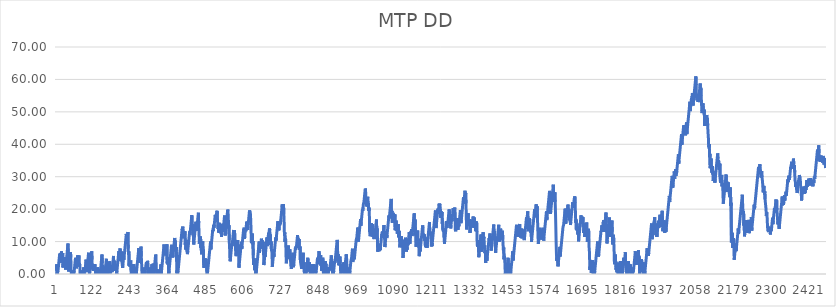
| Category | MTP DD |
|---|---|
| 0 | 1 |
| 1 | 2 |
| 2 | 3 |
| 3 | 0 |
| 4 | 0 |
| 5 | 0 |
| 6 | 1 |
| 7 | 2 |
| 8 | 3 |
| 9 | 4 |
| 10 | 5 |
| 11 | 6 |
| 12 | 5.38 |
| 13 | 6.38 |
| 14 | 3.98 |
| 15 | 4.98 |
| 16 | 5.98 |
| 17 | 6.98 |
| 18 | 3.45 |
| 19 | 4.45 |
| 20 | 5.45 |
| 21 | 6.45 |
| 22 | 2.04 |
| 23 | 3.04 |
| 24 | 2.14 |
| 25 | 3.14 |
| 26 | 4.14 |
| 27 | 5.14 |
| 28 | 2.4 |
| 29 | 3.4 |
| 30 | 1.39 |
| 31 | 2.39 |
| 32 | 3.39 |
| 33 | 4.39 |
| 34 | 5.39 |
| 35 | 6.39 |
| 36 | 7.39 |
| 37 | 8.39 |
| 38 | 9.39 |
| 39 | 5.57 |
| 40 | 0.77 |
| 41 | 1.77 |
| 42 | 2.77 |
| 43 | 3.77 |
| 44 | 4.77 |
| 45 | 5.77 |
| 46 | 6.77 |
| 47 | 5.054 |
| 48 | 0.644 |
| 49 | 0 |
| 50 | 0 |
| 51 | 0 |
| 52 | 1 |
| 53 | 0 |
| 54 | 0 |
| 55 | 1 |
| 56 | 0.07 |
| 57 | 0 |
| 58 | 1 |
| 59 | 2 |
| 60 | 3 |
| 61 | 4 |
| 62 | 5 |
| 63 | 3.9 |
| 64 | 4.9 |
| 65 | 1.76 |
| 66 | 2.76 |
| 67 | 3.76 |
| 68 | 4.76 |
| 69 | 5.76 |
| 70 | 2.72 |
| 71 | 3.72 |
| 72 | 4.72 |
| 73 | 5.72 |
| 74 | 2.29 |
| 75 | 3.29 |
| 76 | 2.47 |
| 77 | 0 |
| 78 | 0 |
| 79 | 0 |
| 80 | 1 |
| 81 | 0 |
| 82 | 1 |
| 83 | 0 |
| 84 | 1 |
| 85 | 0.09 |
| 86 | 0 |
| 87 | 1 |
| 88 | 2 |
| 89 | 0 |
| 90 | 0 |
| 91 | 1 |
| 92 | 2 |
| 93 | 1.43 |
| 94 | 2.43 |
| 95 | 3.43 |
| 96 | 4.43 |
| 97 | 1.29 |
| 98 | 0.57 |
| 99 | 1.57 |
| 100 | 2.57 |
| 101 | 3.57 |
| 102 | 4.57 |
| 103 | 5.57 |
| 104 | 6.57 |
| 105 | 3.24 |
| 106 | 2.41 |
| 107 | 0 |
| 108 | 1 |
| 109 | 2 |
| 110 | 3 |
| 111 | 4 |
| 112 | 5 |
| 113 | 6 |
| 114 | 7 |
| 115 | 4.45 |
| 116 | 1.41 |
| 117 | 2.41 |
| 118 | 1.88 |
| 119 | 0.98 |
| 120 | 1.98 |
| 121 | 2.98 |
| 122 | 1.06 |
| 123 | 2.06 |
| 124 | 3.06 |
| 125 | 2.16 |
| 126 | 0.44 |
| 127 | 0 |
| 128 | 0 |
| 129 | 0 |
| 130 | 1 |
| 131 | 0.06 |
| 132 | 1.06 |
| 133 | 2.06 |
| 134 | 1.51 |
| 135 | 0 |
| 136 | 1 |
| 137 | 0 |
| 138 | 0 |
| 139 | 0 |
| 140 | 1 |
| 141 | 0 |
| 142 | 1 |
| 143 | 2 |
| 144 | 3 |
| 145 | 4 |
| 146 | 5 |
| 147 | 6 |
| 148 | 3.35 |
| 149 | 0.41 |
| 150 | 0 |
| 151 | 0 |
| 152 | 1 |
| 153 | 2 |
| 154 | 1.42 |
| 155 | 0 |
| 156 | 1 |
| 157 | 2 |
| 158 | 1.68 |
| 159 | 2.68 |
| 160 | 3.68 |
| 161 | 4.68 |
| 162 | 1.45 |
| 163 | 0 |
| 164 | 1 |
| 165 | 0 |
| 166 | 1 |
| 167 | 2 |
| 168 | 1.62 |
| 169 | 2.62 |
| 170 | 1.91 |
| 171 | 2.91 |
| 172 | 3.91 |
| 173 | 0.19 |
| 174 | 0 |
| 175 | 1 |
| 176 | 2 |
| 177 | 1.64 |
| 178 | 2.64 |
| 179 | 0.58 |
| 180 | 1.58 |
| 181 | 2.58 |
| 182 | 3.58 |
| 183 | 4.58 |
| 184 | 5.58 |
| 185 | 1.07 |
| 186 | 2.07 |
| 187 | 3.07 |
| 188 | 4.07 |
| 189 | 1.87 |
| 190 | 2.87 |
| 191 | 0.91 |
| 192 | 1.91 |
| 193 | 2.91 |
| 194 | 0 |
| 195 | 1 |
| 196 | 2 |
| 197 | 3 |
| 198 | 4 |
| 199 | 5 |
| 200 | 6 |
| 201 | 7 |
| 202 | 4.89 |
| 203 | 5.89 |
| 204 | 6.89 |
| 205 | 7.89 |
| 206 | 4.85 |
| 207 | 3.96 |
| 208 | 4.96 |
| 209 | 5.96 |
| 210 | 6.96 |
| 211 | 3.73 |
| 212 | 2.9 |
| 213 | 1.86 |
| 214 | 2.86 |
| 215 | 3.86 |
| 216 | 4.86 |
| 217 | 4.36 |
| 218 | 5.36 |
| 219 | 6.36 |
| 220 | 7.36 |
| 221 | 8.36 |
| 222 | 9.36 |
| 223 | 10.36 |
| 224 | 11.36 |
| 225 | 12.36 |
| 226 | 10.35 |
| 227 | 9.96 |
| 228 | 10.96 |
| 229 | 11.96 |
| 230 | 12.96 |
| 231 | 7.86 |
| 232 | 6 |
| 233 | 7 |
| 234 | 2.49 |
| 235 | 3.49 |
| 236 | 3.03 |
| 237 | 2.19 |
| 238 | 3.19 |
| 239 | 4.19 |
| 240 | 1.15 |
| 241 | 0 |
| 242 | 1 |
| 243 | 0 |
| 244 | 0 |
| 245 | 1 |
| 246 | 2 |
| 247 | 3 |
| 248 | 2.04 |
| 249 | 3.04 |
| 250 | 0 |
| 251 | 0 |
| 252 | 0 |
| 253 | 0 |
| 254 | 0 |
| 255 | 1 |
| 256 | 2 |
| 257 | 0 |
| 258 | 1 |
| 259 | 2 |
| 260 | 3 |
| 261 | 4 |
| 262 | 5 |
| 263 | 6 |
| 264 | 7 |
| 265 | 8 |
| 266 | 5.5 |
| 267 | 3.44 |
| 268 | 4.44 |
| 269 | 5.44 |
| 270 | 6.44 |
| 271 | 7.44 |
| 272 | 8.44 |
| 273 | 5.4 |
| 274 | 3.2 |
| 275 | 0.46 |
| 276 | 0 |
| 277 | 0 |
| 278 | 0 |
| 279 | 0 |
| 280 | 1 |
| 281 | 0 |
| 282 | 1 |
| 283 | 2 |
| 284 | 0 |
| 285 | 0 |
| 286 | 1 |
| 287 | 2 |
| 288 | 3 |
| 289 | 2.71 |
| 290 | 3.71 |
| 291 | 2.06 |
| 292 | 3.06 |
| 293 | 4.06 |
| 294 | 3.65 |
| 295 | 0 |
| 296 | 1 |
| 297 | 2 |
| 298 | 0 |
| 299 | 1 |
| 300 | 0 |
| 301 | 1 |
| 302 | 0 |
| 303 | 1 |
| 304 | 0 |
| 305 | 1 |
| 306 | 2 |
| 307 | 3 |
| 308 | 0.21 |
| 309 | 1.21 |
| 310 | 2.21 |
| 311 | 3.21 |
| 312 | 2.26 |
| 313 | 0 |
| 314 | 1 |
| 315 | 2 |
| 316 | 3 |
| 317 | 4 |
| 318 | 5 |
| 319 | 6 |
| 320 | 5.54 |
| 321 | 1.82 |
| 322 | 0.8 |
| 323 | 0 |
| 324 | 1 |
| 325 | 0 |
| 326 | 1 |
| 327 | 0.36 |
| 328 | 1.36 |
| 329 | 0 |
| 330 | 0 |
| 331 | 0 |
| 332 | 1 |
| 333 | 0 |
| 334 | 1 |
| 335 | 2 |
| 336 | 3 |
| 337 | 0.11 |
| 338 | 1.11 |
| 339 | 2.11 |
| 340 | 3.11 |
| 341 | 4.11 |
| 342 | 5.11 |
| 343 | 6.11 |
| 344 | 7.11 |
| 345 | 8.11 |
| 346 | 9.11 |
| 347 | 6.07 |
| 348 | 7.07 |
| 349 | 6.4 |
| 350 | 5.72 |
| 351 | 6.72 |
| 352 | 7.72 |
| 353 | 7.15 |
| 354 | 8.15 |
| 355 | 9.15 |
| 356 | 3.27 |
| 357 | 4.27 |
| 358 | 5.27 |
| 359 | 2.87 |
| 360 | 3.87 |
| 361 | 0 |
| 362 | 1 |
| 363 | 2 |
| 364 | 3 |
| 365 | 4 |
| 366 | 5 |
| 367 | 6 |
| 368 | 7 |
| 369 | 8 |
| 370 | 9 |
| 371 | 6.84 |
| 372 | 7.84 |
| 373 | 8.84 |
| 374 | 5.12 |
| 375 | 6.12 |
| 376 | 7.12 |
| 377 | 8.12 |
| 378 | 9.12 |
| 379 | 10.12 |
| 380 | 11.12 |
| 381 | 9.28 |
| 382 | 10.28 |
| 383 | 7.78 |
| 384 | 7.28 |
| 385 | 8.28 |
| 386 | 5.05 |
| 387 | 0.15 |
| 388 | 1.15 |
| 389 | 0 |
| 390 | 0 |
| 391 | 1 |
| 392 | 2 |
| 393 | 3 |
| 394 | 4 |
| 395 | 5 |
| 396 | 6 |
| 397 | 7 |
| 398 | 8 |
| 399 | 9 |
| 400 | 10 |
| 401 | 11 |
| 402 | 12 |
| 403 | 13 |
| 404 | 14 |
| 405 | 13.6 |
| 406 | 14.6 |
| 407 | 11.95 |
| 408 | 11.7 |
| 409 | 11.01 |
| 410 | 12.01 |
| 411 | 11.17 |
| 412 | 12.17 |
| 413 | 13.17 |
| 414 | 9.05 |
| 415 | 10.05 |
| 416 | 7.5 |
| 417 | 8.5 |
| 418 | 9.5 |
| 419 | 10.5 |
| 420 | 6.68 |
| 421 | 6.13 |
| 422 | 7.13 |
| 423 | 8.13 |
| 424 | 9.13 |
| 425 | 10.13 |
| 426 | 11.13 |
| 427 | 12.13 |
| 428 | 13.13 |
| 429 | 12.17 |
| 430 | 13.17 |
| 431 | 14.17 |
| 432 | 15.17 |
| 433 | 16.17 |
| 434 | 17.17 |
| 435 | 18.17 |
| 436 | 16.06 |
| 437 | 13.37 |
| 438 | 14.37 |
| 439 | 15.37 |
| 440 | 11.55 |
| 441 | 9.1 |
| 442 | 10.1 |
| 443 | 11.1 |
| 444 | 12.1 |
| 445 | 13.1 |
| 446 | 14.1 |
| 447 | 15.1 |
| 448 | 16.1 |
| 449 | 13.31 |
| 450 | 14.31 |
| 451 | 15.31 |
| 452 | 14.91 |
| 453 | 15.91 |
| 454 | 16.91 |
| 455 | 17.91 |
| 456 | 18.91 |
| 457 | 15.68 |
| 458 | 12.99 |
| 459 | 9.36 |
| 460 | 10.36 |
| 461 | 11.36 |
| 462 | 10.55 |
| 463 | 11.55 |
| 464 | 8.12 |
| 465 | 9.12 |
| 466 | 6.08 |
| 467 | 7.08 |
| 468 | 8.08 |
| 469 | 9.08 |
| 470 | 10.08 |
| 471 | 6.55 |
| 472 | 7.55 |
| 473 | 2.75 |
| 474 | 1.89 |
| 475 | 2.89 |
| 476 | 3.89 |
| 477 | 4.89 |
| 478 | 2.69 |
| 479 | 3.69 |
| 480 | 4.69 |
| 481 | 2.29 |
| 482 | 3.29 |
| 483 | 0.79 |
| 484 | 0 |
| 485 | 0 |
| 486 | 1 |
| 487 | 2 |
| 488 | 3 |
| 489 | 4 |
| 490 | 5 |
| 491 | 6 |
| 492 | 7 |
| 493 | 8 |
| 494 | 9 |
| 495 | 10 |
| 496 | 7.6 |
| 497 | 8.6 |
| 498 | 9.6 |
| 499 | 10.6 |
| 500 | 11.6 |
| 501 | 12.6 |
| 502 | 13.6 |
| 503 | 13.18 |
| 504 | 14.18 |
| 505 | 15.18 |
| 506 | 14.26 |
| 507 | 15.26 |
| 508 | 16.26 |
| 509 | 17.26 |
| 510 | 18.26 |
| 511 | 17.76 |
| 512 | 16.79 |
| 513 | 17.79 |
| 514 | 18.79 |
| 515 | 18.48 |
| 516 | 19.48 |
| 517 | 16.79 |
| 518 | 15.65 |
| 519 | 13.93 |
| 520 | 14.93 |
| 521 | 12.77 |
| 522 | 13.77 |
| 523 | 14.77 |
| 524 | 15.77 |
| 525 | 12.63 |
| 526 | 13.63 |
| 527 | 12.63 |
| 528 | 13.63 |
| 529 | 14.63 |
| 530 | 11.49 |
| 531 | 12.49 |
| 532 | 13.49 |
| 533 | 14.49 |
| 534 | 15.49 |
| 535 | 13.04 |
| 536 | 14.04 |
| 537 | 15.04 |
| 538 | 16.04 |
| 539 | 17.04 |
| 540 | 18.04 |
| 541 | 14.12 |
| 542 | 11.87 |
| 543 | 12.87 |
| 544 | 13.87 |
| 545 | 14.87 |
| 546 | 15.87 |
| 547 | 16.87 |
| 548 | 17.87 |
| 549 | 18.87 |
| 550 | 19.87 |
| 551 | 19.35 |
| 552 | 17.24 |
| 553 | 14.01 |
| 554 | 15.01 |
| 555 | 10.4 |
| 556 | 7.85 |
| 557 | 8.85 |
| 558 | 3.95 |
| 559 | 4.95 |
| 560 | 5.95 |
| 561 | 6.95 |
| 562 | 7.95 |
| 563 | 8.95 |
| 564 | 8.58 |
| 565 | 9.58 |
| 566 | 10.58 |
| 567 | 11.58 |
| 568 | 12.58 |
| 569 | 13.58 |
| 570 | 11.47 |
| 571 | 12.47 |
| 572 | 13.47 |
| 573 | 9.45 |
| 574 | 10.45 |
| 575 | 8 |
| 576 | 6.14 |
| 577 | 5.5 |
| 578 | 6.5 |
| 579 | 7.5 |
| 580 | 8.5 |
| 581 | 9.5 |
| 582 | 10.5 |
| 583 | 8.05 |
| 584 | 9.05 |
| 585 | 6.36 |
| 586 | 1.95 |
| 587 | 2.95 |
| 588 | 3.95 |
| 589 | 4.95 |
| 590 | 5.95 |
| 591 | 6.95 |
| 592 | 7.95 |
| 593 | 8.95 |
| 594 | 9.95 |
| 595 | 7.75 |
| 596 | 8.75 |
| 597 | 9.75 |
| 598 | 10.75 |
| 599 | 11.75 |
| 600 | 12.75 |
| 601 | 13.75 |
| 602 | 13.27 |
| 603 | 14.27 |
| 604 | 10.84 |
| 605 | 11.84 |
| 606 | 12.84 |
| 607 | 13.84 |
| 608 | 13.18 |
| 609 | 14.18 |
| 610 | 15.18 |
| 611 | 16.18 |
| 612 | 15.33 |
| 613 | 14.36 |
| 614 | 13.62 |
| 615 | 14.62 |
| 616 | 15.62 |
| 617 | 16.62 |
| 618 | 17.62 |
| 619 | 18.62 |
| 620 | 19.62 |
| 621 | 19.38 |
| 622 | 18.86 |
| 623 | 18.51 |
| 624 | 16.16 |
| 625 | 12.93 |
| 626 | 9.5 |
| 627 | 10.5 |
| 628 | 11.5 |
| 629 | 12.5 |
| 630 | 9.17 |
| 631 | 10.17 |
| 632 | 5.76 |
| 633 | 2.82 |
| 634 | 3.82 |
| 635 | 4.82 |
| 636 | 1.19 |
| 637 | 2.19 |
| 638 | 3.19 |
| 639 | 4.19 |
| 640 | 0 |
| 641 | 0 |
| 642 | 1 |
| 643 | 2 |
| 644 | 3 |
| 645 | 4 |
| 646 | 5 |
| 647 | 6 |
| 648 | 7 |
| 649 | 8 |
| 650 | 9 |
| 651 | 10 |
| 652 | 6.57 |
| 653 | 7.57 |
| 654 | 8.57 |
| 655 | 7.9 |
| 656 | 8.9 |
| 657 | 9.9 |
| 658 | 10.9 |
| 659 | 8.4 |
| 660 | 9.4 |
| 661 | 10.4 |
| 662 | 7.9 |
| 663 | 8.9 |
| 664 | 9.9 |
| 665 | 6.57 |
| 666 | 2.75 |
| 667 | 3.75 |
| 668 | 4.75 |
| 669 | 5.75 |
| 670 | 5.3 |
| 671 | 6.3 |
| 672 | 7.3 |
| 673 | 8.3 |
| 674 | 9.3 |
| 675 | 10.3 |
| 676 | 11.3 |
| 677 | 8.61 |
| 678 | 9.61 |
| 679 | 10.61 |
| 680 | 11.61 |
| 681 | 12.61 |
| 682 | 12.08 |
| 683 | 13.08 |
| 684 | 14.08 |
| 685 | 13.45 |
| 686 | 11.15 |
| 687 | 12.15 |
| 688 | 9.01 |
| 689 | 10.01 |
| 690 | 7.81 |
| 691 | 7.02 |
| 692 | 6.64 |
| 693 | 2.23 |
| 694 | 3.23 |
| 695 | 4.23 |
| 696 | 5.23 |
| 697 | 6.23 |
| 698 | 5.25 |
| 699 | 6.25 |
| 700 | 7.25 |
| 701 | 8.25 |
| 702 | 9.25 |
| 703 | 10.25 |
| 704 | 11.25 |
| 705 | 10.28 |
| 706 | 11.28 |
| 707 | 12.28 |
| 708 | 13.28 |
| 709 | 14.28 |
| 710 | 15.28 |
| 711 | 16.28 |
| 712 | 14.71 |
| 713 | 15.71 |
| 714 | 13.46 |
| 715 | 14.46 |
| 716 | 15.46 |
| 717 | 14.99 |
| 718 | 15.99 |
| 719 | 15.47 |
| 720 | 16.47 |
| 721 | 17.47 |
| 722 | 18.47 |
| 723 | 19.47 |
| 724 | 20.47 |
| 725 | 21.47 |
| 726 | 18.53 |
| 727 | 19.53 |
| 728 | 20.53 |
| 729 | 21.53 |
| 730 | 18.3 |
| 731 | 15.85 |
| 732 | 11.83 |
| 733 | 12.83 |
| 734 | 9.89 |
| 735 | 10.89 |
| 736 | 10.54 |
| 737 | 6.13 |
| 738 | 3.29 |
| 739 | 4.29 |
| 740 | 5.29 |
| 741 | 6.29 |
| 742 | 7.29 |
| 743 | 6.77 |
| 744 | 7.77 |
| 745 | 8.77 |
| 746 | 4.65 |
| 747 | 5.65 |
| 748 | 6.65 |
| 749 | 7.65 |
| 750 | 6.45 |
| 751 | 4.2 |
| 752 | 5.2 |
| 753 | 2.46 |
| 754 | 1.55 |
| 755 | 2.55 |
| 756 | 3.55 |
| 757 | 4.55 |
| 758 | 5.55 |
| 759 | 6.55 |
| 760 | 3.02 |
| 761 | 2.09 |
| 762 | 3.09 |
| 763 | 4.09 |
| 764 | 5.09 |
| 765 | 6.09 |
| 766 | 7.09 |
| 767 | 8.09 |
| 768 | 7.5 |
| 769 | 8.5 |
| 770 | 8 |
| 771 | 9 |
| 772 | 10 |
| 773 | 11 |
| 774 | 12 |
| 775 | 9.99 |
| 776 | 10.99 |
| 777 | 8.79 |
| 778 | 9.79 |
| 779 | 10.79 |
| 780 | 7.85 |
| 781 | 7.48 |
| 782 | 8.48 |
| 783 | 4.36 |
| 784 | 3.34 |
| 785 | 3.05 |
| 786 | 2.27 |
| 787 | 1.56 |
| 788 | 2.56 |
| 789 | 3.56 |
| 790 | 4.56 |
| 791 | 5.56 |
| 792 | 6.56 |
| 793 | 1.66 |
| 794 | 2.66 |
| 795 | 3.66 |
| 796 | 0 |
| 797 | 1 |
| 798 | 0.08 |
| 799 | 1.08 |
| 800 | 0 |
| 801 | 0 |
| 802 | 0 |
| 803 | 1 |
| 804 | 2 |
| 805 | 3 |
| 806 | 4 |
| 807 | 5 |
| 808 | 0.79 |
| 809 | 0.61 |
| 810 | 1.61 |
| 811 | 2.61 |
| 812 | 3.61 |
| 813 | 1.26 |
| 814 | 2.26 |
| 815 | 0 |
| 816 | 1 |
| 817 | 0 |
| 818 | 0 |
| 819 | 1 |
| 820 | 2 |
| 821 | 3 |
| 822 | 0.11 |
| 823 | 0 |
| 824 | 0 |
| 825 | 1 |
| 826 | 2 |
| 827 | 3 |
| 828 | 0.6 |
| 829 | 0.27 |
| 830 | 1.27 |
| 831 | 0.78 |
| 832 | 0.14 |
| 833 | 0 |
| 834 | 1 |
| 835 | 2 |
| 836 | 3 |
| 837 | 4 |
| 838 | 5 |
| 839 | 3.04 |
| 840 | 4.04 |
| 841 | 5.04 |
| 842 | 6.04 |
| 843 | 7.04 |
| 844 | 3.61 |
| 845 | 4.61 |
| 846 | 5.61 |
| 847 | 4.82 |
| 848 | 5.82 |
| 849 | 2.59 |
| 850 | 3.59 |
| 851 | 1.04 |
| 852 | 2.04 |
| 853 | 3.04 |
| 854 | 4.04 |
| 855 | 5.04 |
| 856 | 2 |
| 857 | 0 |
| 858 | 1 |
| 859 | 0 |
| 860 | 1 |
| 861 | 2 |
| 862 | 3 |
| 863 | 4 |
| 864 | 2.16 |
| 865 | 3.16 |
| 866 | 0.96 |
| 867 | 1.96 |
| 868 | 0 |
| 869 | 1 |
| 870 | 2 |
| 871 | 0 |
| 872 | 0 |
| 873 | 0 |
| 874 | 1 |
| 875 | 2 |
| 876 | 1.09 |
| 877 | 2.09 |
| 878 | 1.75 |
| 879 | 2.75 |
| 880 | 3.75 |
| 881 | 4.75 |
| 882 | 5.75 |
| 883 | 5.12 |
| 884 | 2.72 |
| 885 | 3.72 |
| 886 | 1.12 |
| 887 | 0 |
| 888 | 1 |
| 889 | 0 |
| 890 | 1 |
| 891 | 2 |
| 892 | 3 |
| 893 | 4 |
| 894 | 3.51 |
| 895 | 4.51 |
| 896 | 5.51 |
| 897 | 6.51 |
| 898 | 7.51 |
| 899 | 8.51 |
| 900 | 9.51 |
| 901 | 10.51 |
| 902 | 9.59 |
| 903 | 4.1 |
| 904 | 5.1 |
| 905 | 6.1 |
| 906 | 2.67 |
| 907 | 2.37 |
| 908 | 3.37 |
| 909 | 4.37 |
| 910 | 5.37 |
| 911 | 3.21 |
| 912 | 0.96 |
| 913 | 0 |
| 914 | 0 |
| 915 | 1 |
| 916 | 2 |
| 917 | 3 |
| 918 | 0.35 |
| 919 | 1.35 |
| 920 | 2.35 |
| 921 | 3.35 |
| 922 | 2.61 |
| 923 | 3.61 |
| 924 | 0.08 |
| 925 | 1.08 |
| 926 | 2.08 |
| 927 | 3.08 |
| 928 | 4.08 |
| 929 | 5.08 |
| 930 | 6.08 |
| 931 | 5.33 |
| 932 | 3.49 |
| 933 | 0 |
| 934 | 0 |
| 935 | 0 |
| 936 | 0 |
| 937 | 1 |
| 938 | 0 |
| 939 | 1 |
| 940 | 2 |
| 941 | 0 |
| 942 | 1 |
| 943 | 2 |
| 944 | 3 |
| 945 | 4 |
| 946 | 3.81 |
| 947 | 4.81 |
| 948 | 5.81 |
| 949 | 6.81 |
| 950 | 7.81 |
| 951 | 3.69 |
| 952 | 4.69 |
| 953 | 5.69 |
| 954 | 6.69 |
| 955 | 7.69 |
| 956 | 4.55 |
| 957 | 5.55 |
| 958 | 6.55 |
| 959 | 7.55 |
| 960 | 8.55 |
| 961 | 9.55 |
| 962 | 10.55 |
| 963 | 10.31 |
| 964 | 11.31 |
| 965 | 12.31 |
| 966 | 13.31 |
| 967 | 14.31 |
| 968 | 12.15 |
| 969 | 9.95 |
| 970 | 10.95 |
| 971 | 11.95 |
| 972 | 12.95 |
| 973 | 13.95 |
| 974 | 14.95 |
| 975 | 15.95 |
| 976 | 16.95 |
| 977 | 14.89 |
| 978 | 15.89 |
| 979 | 16.89 |
| 980 | 17.89 |
| 981 | 18.89 |
| 982 | 19.89 |
| 983 | 19.5 |
| 984 | 20.5 |
| 985 | 21.5 |
| 986 | 21.35 |
| 987 | 22.35 |
| 988 | 23.35 |
| 989 | 24.35 |
| 990 | 25.35 |
| 991 | 26.35 |
| 992 | 26.02 |
| 993 | 23.13 |
| 994 | 22.03 |
| 995 | 21.77 |
| 996 | 20.83 |
| 997 | 21.83 |
| 998 | 22.83 |
| 999 | 23.83 |
| 1000 | 20.89 |
| 1001 | 21.89 |
| 1002 | 19.49 |
| 1003 | 20.49 |
| 1004 | 19.58 |
| 1005 | 12.92 |
| 1006 | 13.92 |
| 1007 | 11.67 |
| 1008 | 12.67 |
| 1009 | 13.67 |
| 1010 | 14.67 |
| 1011 | 15.67 |
| 1012 | 12.34 |
| 1013 | 13.34 |
| 1014 | 14.34 |
| 1015 | 15.34 |
| 1016 | 11.42 |
| 1017 | 12.42 |
| 1018 | 11.81 |
| 1019 | 10.77 |
| 1020 | 11.77 |
| 1021 | 10.79 |
| 1022 | 11.79 |
| 1023 | 12.79 |
| 1024 | 13.79 |
| 1025 | 14.79 |
| 1026 | 15.79 |
| 1027 | 16.79 |
| 1028 | 13.07 |
| 1029 | 14.07 |
| 1030 | 11.28 |
| 1031 | 6.87 |
| 1032 | 7.87 |
| 1033 | 8.87 |
| 1034 | 8.35 |
| 1035 | 9.35 |
| 1036 | 7.05 |
| 1037 | 8.05 |
| 1038 | 9.05 |
| 1039 | 7.36 |
| 1040 | 8.36 |
| 1041 | 9.36 |
| 1042 | 10.36 |
| 1043 | 11.36 |
| 1044 | 12.36 |
| 1045 | 12.05 |
| 1046 | 13.05 |
| 1047 | 11.09 |
| 1048 | 12.09 |
| 1049 | 13.09 |
| 1050 | 14.09 |
| 1051 | 15.09 |
| 1052 | 11.76 |
| 1053 | 11.14 |
| 1054 | 8.3 |
| 1055 | 9.3 |
| 1056 | 10.3 |
| 1057 | 11.3 |
| 1058 | 12.3 |
| 1059 | 13.3 |
| 1060 | 11.1 |
| 1061 | 12.1 |
| 1062 | 13.1 |
| 1063 | 14.1 |
| 1064 | 15.1 |
| 1065 | 16.1 |
| 1066 | 17.1 |
| 1067 | 18.1 |
| 1068 | 17.16 |
| 1069 | 18.16 |
| 1070 | 19.16 |
| 1071 | 20.16 |
| 1072 | 21.16 |
| 1073 | 22.16 |
| 1074 | 23.16 |
| 1075 | 19.34 |
| 1076 | 18.47 |
| 1077 | 19.47 |
| 1078 | 15.84 |
| 1079 | 16.84 |
| 1080 | 17.84 |
| 1081 | 18.84 |
| 1082 | 16.05 |
| 1083 | 17.05 |
| 1084 | 16.41 |
| 1085 | 17.41 |
| 1086 | 18.41 |
| 1087 | 13.51 |
| 1088 | 14.51 |
| 1089 | 15.51 |
| 1090 | 16.51 |
| 1091 | 13.37 |
| 1092 | 14.37 |
| 1093 | 15.37 |
| 1094 | 12.43 |
| 1095 | 13.43 |
| 1096 | 14.43 |
| 1097 | 15.43 |
| 1098 | 11.31 |
| 1099 | 12.31 |
| 1100 | 13.31 |
| 1101 | 10.52 |
| 1102 | 8.22 |
| 1103 | 9.22 |
| 1104 | 10.22 |
| 1105 | 9.63 |
| 1106 | 10.63 |
| 1107 | 11.63 |
| 1108 | 8.59 |
| 1109 | 9.59 |
| 1110 | 10.59 |
| 1111 | 8.09 |
| 1112 | 4.95 |
| 1113 | 5.95 |
| 1114 | 6.95 |
| 1115 | 7.95 |
| 1116 | 8.95 |
| 1117 | 8.21 |
| 1118 | 9.21 |
| 1119 | 10.21 |
| 1120 | 11.21 |
| 1121 | 8.96 |
| 1122 | 9.96 |
| 1123 | 6.92 |
| 1124 | 7.92 |
| 1125 | 7.47 |
| 1126 | 8.47 |
| 1127 | 9.47 |
| 1128 | 8.91 |
| 1129 | 9.91 |
| 1130 | 10.91 |
| 1131 | 11.91 |
| 1132 | 12.91 |
| 1133 | 12.26 |
| 1134 | 9.32 |
| 1135 | 10.32 |
| 1136 | 11.32 |
| 1137 | 12.32 |
| 1138 | 13.32 |
| 1139 | 12.86 |
| 1140 | 13.86 |
| 1141 | 11.7 |
| 1142 | 12.7 |
| 1143 | 13.7 |
| 1144 | 14.7 |
| 1145 | 15.7 |
| 1146 | 16.7 |
| 1147 | 17.7 |
| 1148 | 18.7 |
| 1149 | 14.78 |
| 1150 | 15.78 |
| 1151 | 16.78 |
| 1152 | 13.55 |
| 1153 | 10.32 |
| 1154 | 8.4 |
| 1155 | 9.4 |
| 1156 | 10.4 |
| 1157 | 11.4 |
| 1158 | 12.4 |
| 1159 | 13.4 |
| 1160 | 8.89 |
| 1161 | 9.89 |
| 1162 | 10.89 |
| 1163 | 8.1 |
| 1164 | 5.5 |
| 1165 | 6.5 |
| 1166 | 7.5 |
| 1167 | 6.99 |
| 1168 | 7.99 |
| 1169 | 8.99 |
| 1170 | 9.99 |
| 1171 | 10.99 |
| 1172 | 11.99 |
| 1173 | 12.99 |
| 1174 | 13.99 |
| 1175 | 14.99 |
| 1176 | 14.14 |
| 1177 | 11.4 |
| 1178 | 12.4 |
| 1179 | 11.59 |
| 1180 | 11.15 |
| 1181 | 12.15 |
| 1182 | 10.29 |
| 1183 | 11.29 |
| 1184 | 8.25 |
| 1185 | 8 |
| 1186 | 9 |
| 1187 | 10 |
| 1188 | 11 |
| 1189 | 8.06 |
| 1190 | 9.06 |
| 1191 | 10.06 |
| 1192 | 11.06 |
| 1193 | 12.06 |
| 1194 | 13.06 |
| 1195 | 14.06 |
| 1196 | 15.06 |
| 1197 | 16.06 |
| 1198 | 12.24 |
| 1199 | 12.04 |
| 1200 | 13.04 |
| 1201 | 12.04 |
| 1202 | 11.44 |
| 1203 | 8.5 |
| 1204 | 9.5 |
| 1205 | 8.61 |
| 1206 | 9.61 |
| 1207 | 10.61 |
| 1208 | 11.61 |
| 1209 | 12.61 |
| 1210 | 13.61 |
| 1211 | 14.61 |
| 1212 | 15.61 |
| 1213 | 16.61 |
| 1214 | 17.61 |
| 1215 | 18.61 |
| 1216 | 19.61 |
| 1217 | 16.57 |
| 1218 | 14.17 |
| 1219 | 15.17 |
| 1220 | 16.17 |
| 1221 | 17.17 |
| 1222 | 18.17 |
| 1223 | 19.17 |
| 1224 | 20.17 |
| 1225 | 18.68 |
| 1226 | 19.68 |
| 1227 | 20.68 |
| 1228 | 21.68 |
| 1229 | 20.64 |
| 1230 | 21.64 |
| 1231 | 18.9 |
| 1232 | 19.9 |
| 1233 | 17.3 |
| 1234 | 18.3 |
| 1235 | 19.3 |
| 1236 | 18.074 |
| 1237 | 19.074 |
| 1238 | 15.544 |
| 1239 | 16.544 |
| 1240 | 13.504 |
| 1241 | 13.284 |
| 1242 | 13.044 |
| 1243 | 14.044 |
| 1244 | 11.104 |
| 1245 | 9.324 |
| 1246 | 10.324 |
| 1247 | 11.324 |
| 1248 | 12.324 |
| 1249 | 13.324 |
| 1250 | 14.324 |
| 1251 | 15.324 |
| 1252 | 16.324 |
| 1253 | 14.214 |
| 1254 | 15.214 |
| 1255 | 14.944 |
| 1256 | 15.944 |
| 1257 | 16.944 |
| 1258 | 17.944 |
| 1259 | 18.944 |
| 1260 | 19.944 |
| 1261 | 19.124 |
| 1262 | 16.574 |
| 1263 | 17.574 |
| 1264 | 16.804 |
| 1265 | 14.064 |
| 1266 | 15.064 |
| 1267 | 16.064 |
| 1268 | 17.064 |
| 1269 | 16.304 |
| 1270 | 17.304 |
| 1271 | 18.304 |
| 1272 | 19.304 |
| 1273 | 20.304 |
| 1274 | 18.054 |
| 1275 | 19.054 |
| 1276 | 18.484 |
| 1277 | 19.484 |
| 1278 | 20.484 |
| 1279 | 16.854 |
| 1280 | 13.524 |
| 1281 | 13.164 |
| 1282 | 14.164 |
| 1283 | 15.164 |
| 1284 | 16.164 |
| 1285 | 17.164 |
| 1286 | 16.274 |
| 1287 | 17.274 |
| 1288 | 13.644 |
| 1289 | 14.644 |
| 1290 | 15.644 |
| 1291 | 14.684 |
| 1292 | 15.684 |
| 1293 | 16.684 |
| 1294 | 17.684 |
| 1295 | 18.684 |
| 1296 | 19.684 |
| 1297 | 18.914 |
| 1298 | 15.684 |
| 1299 | 16.684 |
| 1300 | 17.684 |
| 1301 | 18.684 |
| 1302 | 19.684 |
| 1303 | 20.684 |
| 1304 | 21.684 |
| 1305 | 22.684 |
| 1306 | 23.684 |
| 1307 | 21.674 |
| 1308 | 22.674 |
| 1309 | 23.674 |
| 1310 | 24.674 |
| 1311 | 25.674 |
| 1312 | 23.934 |
| 1313 | 24.934 |
| 1314 | 21.794 |
| 1315 | 17.674 |
| 1316 | 13.754 |
| 1317 | 14.754 |
| 1318 | 15.754 |
| 1319 | 16.754 |
| 1320 | 17.754 |
| 1321 | 18.754 |
| 1322 | 15.714 |
| 1323 | 16.714 |
| 1324 | 14.894 |
| 1325 | 15.894 |
| 1326 | 16.894 |
| 1327 | 12.684 |
| 1328 | 13.684 |
| 1329 | 14.684 |
| 1330 | 15.684 |
| 1331 | 16.684 |
| 1332 | 14.434 |
| 1333 | 15.434 |
| 1334 | 16.434 |
| 1335 | 15.714 |
| 1336 | 16.714 |
| 1337 | 17.714 |
| 1338 | 14.384 |
| 1339 | 15.384 |
| 1340 | 16.384 |
| 1341 | 17.384 |
| 1342 | 14.244 |
| 1343 | 15.244 |
| 1344 | 16.244 |
| 1345 | 13.204 |
| 1346 | 14.204 |
| 1347 | 15.204 |
| 1348 | 16.204 |
| 1349 | 13.064 |
| 1350 | 9.144 |
| 1351 | 8.424 |
| 1352 | 9.424 |
| 1353 | 10.424 |
| 1354 | 8.314 |
| 1355 | 5.174 |
| 1356 | 6.174 |
| 1357 | 7.174 |
| 1358 | 8.174 |
| 1359 | 9.174 |
| 1360 | 10.174 |
| 1361 | 11.174 |
| 1362 | 12.174 |
| 1363 | 6.884 |
| 1364 | 7.884 |
| 1365 | 8.884 |
| 1366 | 9.884 |
| 1367 | 10.884 |
| 1368 | 11.884 |
| 1369 | 12.884 |
| 1370 | 10.484 |
| 1371 | 11.484 |
| 1372 | 10.904 |
| 1373 | 7.764 |
| 1374 | 8.764 |
| 1375 | 6.414 |
| 1376 | 7.414 |
| 1377 | 3.394 |
| 1378 | 4.394 |
| 1379 | 5.394 |
| 1380 | 6.394 |
| 1381 | 4.094 |
| 1382 | 5.094 |
| 1383 | 6.094 |
| 1384 | 7.094 |
| 1385 | 8.094 |
| 1386 | 9.094 |
| 1387 | 10.094 |
| 1388 | 11.094 |
| 1389 | 10.504 |
| 1390 | 11.504 |
| 1391 | 12.504 |
| 1392 | 8.784 |
| 1393 | 9.784 |
| 1394 | 10.784 |
| 1395 | 7.254 |
| 1396 | 8.254 |
| 1397 | 9.254 |
| 1398 | 10.254 |
| 1399 | 11.254 |
| 1400 | 12.254 |
| 1401 | 13.254 |
| 1402 | 14.254 |
| 1403 | 15.254 |
| 1404 | 12.214 |
| 1405 | 13.214 |
| 1406 | 10.474 |
| 1407 | 11.474 |
| 1408 | 8.734 |
| 1409 | 6.534 |
| 1410 | 7.534 |
| 1411 | 8.534 |
| 1412 | 9.534 |
| 1413 | 10.534 |
| 1414 | 10.174 |
| 1415 | 11.174 |
| 1416 | 12.174 |
| 1417 | 13.174 |
| 1418 | 14.174 |
| 1419 | 15.174 |
| 1420 | 12.574 |
| 1421 | 9.974 |
| 1422 | 10.974 |
| 1423 | 11.974 |
| 1424 | 12.974 |
| 1425 | 13.974 |
| 1426 | 13.214 |
| 1427 | 10.614 |
| 1428 | 11.614 |
| 1429 | 11.354 |
| 1430 | 12.354 |
| 1431 | 13.354 |
| 1432 | 10.614 |
| 1433 | 8.944 |
| 1434 | 7.164 |
| 1435 | 8.164 |
| 1436 | 4.534 |
| 1437 | 5.534 |
| 1438 | 4.994 |
| 1439 | 2.794 |
| 1440 | 0 |
| 1441 | 1 |
| 1442 | 0 |
| 1443 | 1 |
| 1444 | 0 |
| 1445 | 1 |
| 1446 | 2 |
| 1447 | 3 |
| 1448 | 4 |
| 1449 | 5 |
| 1450 | 3.08 |
| 1451 | 0.78 |
| 1452 | 1.78 |
| 1453 | 1.39 |
| 1454 | 0 |
| 1455 | 1 |
| 1456 | 2 |
| 1457 | 0 |
| 1458 | 1 |
| 1459 | 2 |
| 1460 | 3 |
| 1461 | 4 |
| 1462 | 5 |
| 1463 | 6 |
| 1464 | 7 |
| 1465 | 4.16 |
| 1466 | 5.16 |
| 1467 | 6.16 |
| 1468 | 7.16 |
| 1469 | 8.16 |
| 1470 | 9.16 |
| 1471 | 10.16 |
| 1472 | 11.16 |
| 1473 | 12.16 |
| 1474 | 13.16 |
| 1475 | 14.16 |
| 1476 | 15.16 |
| 1477 | 11.63 |
| 1478 | 12.63 |
| 1479 | 13.63 |
| 1480 | 13.38 |
| 1481 | 14.38 |
| 1482 | 11.44 |
| 1483 | 12.44 |
| 1484 | 13.44 |
| 1485 | 14.44 |
| 1486 | 15.44 |
| 1487 | 12.3 |
| 1488 | 13.3 |
| 1489 | 11.29 |
| 1490 | 12.29 |
| 1491 | 13.29 |
| 1492 | 13.03 |
| 1493 | 14.03 |
| 1494 | 10.99 |
| 1495 | 11.99 |
| 1496 | 12.99 |
| 1497 | 12.47 |
| 1498 | 13.47 |
| 1499 | 12.68 |
| 1500 | 13.68 |
| 1501 | 10.45 |
| 1502 | 11.45 |
| 1503 | 12.45 |
| 1504 | 13.45 |
| 1505 | 14.45 |
| 1506 | 15.45 |
| 1507 | 16.45 |
| 1508 | 17.45 |
| 1509 | 16.341 |
| 1510 | 17.341 |
| 1511 | 18.341 |
| 1512 | 19.341 |
| 1513 | 15.911 |
| 1514 | 13.171 |
| 1515 | 14.171 |
| 1516 | 15.171 |
| 1517 | 16.171 |
| 1518 | 17.171 |
| 1519 | 13.941 |
| 1520 | 14.941 |
| 1521 | 12.831 |
| 1522 | 13.831 |
| 1523 | 14.831 |
| 1524 | 9.931 |
| 1525 | 10.931 |
| 1526 | 11.931 |
| 1527 | 12.931 |
| 1528 | 13.931 |
| 1529 | 14.931 |
| 1530 | 15.931 |
| 1531 | 16.931 |
| 1532 | 17.931 |
| 1533 | 18.931 |
| 1534 | 19.931 |
| 1535 | 17.481 |
| 1536 | 18.481 |
| 1537 | 19.481 |
| 1538 | 20.481 |
| 1539 | 21.481 |
| 1540 | 18.981 |
| 1541 | 19.981 |
| 1542 | 20.981 |
| 1543 | 18.141 |
| 1544 | 14.811 |
| 1545 | 11.581 |
| 1546 | 9.281 |
| 1547 | 10.281 |
| 1548 | 11.281 |
| 1549 | 12.281 |
| 1550 | 13.281 |
| 1551 | 14.281 |
| 1552 | 11.681 |
| 1553 | 12.681 |
| 1554 | 13.681 |
| 1555 | 10.641 |
| 1556 | 11.641 |
| 1557 | 12.641 |
| 1558 | 13.641 |
| 1559 | 11.241 |
| 1560 | 12.241 |
| 1561 | 13.241 |
| 1562 | 14.241 |
| 1563 | 10.321 |
| 1564 | 11.321 |
| 1565 | 12.321 |
| 1566 | 13.321 |
| 1567 | 14.321 |
| 1568 | 15.321 |
| 1569 | 16.321 |
| 1570 | 17.321 |
| 1571 | 18.321 |
| 1572 | 19.321 |
| 1573 | 16.631 |
| 1574 | 17.631 |
| 1575 | 18.631 |
| 1576 | 19.631 |
| 1577 | 20.631 |
| 1578 | 21.631 |
| 1579 | 22.631 |
| 1580 | 23.631 |
| 1581 | 24.631 |
| 1582 | 25.631 |
| 1583 | 25.111 |
| 1584 | 22.371 |
| 1585 | 18.551 |
| 1586 | 19.551 |
| 1587 | 20.551 |
| 1588 | 21.551 |
| 1589 | 22.551 |
| 1590 | 23.551 |
| 1591 | 24.551 |
| 1592 | 25.551 |
| 1593 | 26.551 |
| 1594 | 27.551 |
| 1595 | 24.411 |
| 1596 | 22.211 |
| 1597 | 23.211 |
| 1598 | 24.211 |
| 1599 | 25.211 |
| 1600 | 22.271 |
| 1601 | 18.841 |
| 1602 | 14.631 |
| 1603 | 10.021 |
| 1604 | 6.301 |
| 1605 | 4.051 |
| 1606 | 5.051 |
| 1607 | 4.261 |
| 1608 | 5.261 |
| 1609 | 2.371 |
| 1610 | 3.371 |
| 1611 | 4.371 |
| 1612 | 5.371 |
| 1613 | 6.371 |
| 1614 | 7.371 |
| 1615 | 8.371 |
| 1616 | 5.431 |
| 1617 | 6.431 |
| 1618 | 7.431 |
| 1619 | 8.431 |
| 1620 | 9.431 |
| 1621 | 10.431 |
| 1622 | 11.431 |
| 1623 | 12.431 |
| 1624 | 13.431 |
| 1625 | 14.431 |
| 1626 | 14.161 |
| 1627 | 15.161 |
| 1628 | 16.161 |
| 1629 | 17.161 |
| 1630 | 18.161 |
| 1631 | 19.161 |
| 1632 | 20.161 |
| 1633 | 17.761 |
| 1634 | 15.511 |
| 1635 | 16.511 |
| 1636 | 17.511 |
| 1637 | 17.401 |
| 1638 | 18.401 |
| 1639 | 19.401 |
| 1640 | 20.401 |
| 1641 | 21.401 |
| 1642 | 19.391 |
| 1643 | 18.981 |
| 1644 | 19.981 |
| 1645 | 16.551 |
| 1646 | 17.551 |
| 1647 | 17.051 |
| 1648 | 18.051 |
| 1649 | 15.111 |
| 1650 | 16.111 |
| 1651 | 17.111 |
| 1652 | 18.111 |
| 1653 | 19.111 |
| 1654 | 20.111 |
| 1655 | 21.111 |
| 1656 | 22.111 |
| 1657 | 20.441 |
| 1658 | 21.441 |
| 1659 | 21.171 |
| 1660 | 22.171 |
| 1661 | 23.171 |
| 1662 | 22.941 |
| 1663 | 23.941 |
| 1664 | 21.981 |
| 1665 | 18.751 |
| 1666 | 15.811 |
| 1667 | 16.811 |
| 1668 | 13.581 |
| 1669 | 14.581 |
| 1670 | 15.581 |
| 1671 | 13.381 |
| 1672 | 14.381 |
| 1673 | 12.221 |
| 1674 | 13.221 |
| 1675 | 10.081 |
| 1676 | 11.081 |
| 1677 | 12.081 |
| 1678 | 13.081 |
| 1679 | 14.081 |
| 1680 | 15.081 |
| 1681 | 16.081 |
| 1682 | 17.081 |
| 1683 | 18.081 |
| 1684 | 15.681 |
| 1685 | 16.681 |
| 1686 | 17.681 |
| 1687 | 15.521 |
| 1688 | 16.521 |
| 1689 | 17.521 |
| 1690 | 14.581 |
| 1691 | 15.581 |
| 1692 | 12.641 |
| 1693 | 13.641 |
| 1694 | 14.641 |
| 1695 | 11.411 |
| 1696 | 12.411 |
| 1697 | 13.411 |
| 1698 | 14.411 |
| 1699 | 13.881 |
| 1700 | 14.881 |
| 1701 | 15.881 |
| 1702 | 12.741 |
| 1703 | 9.951 |
| 1704 | 10.951 |
| 1705 | 11.951 |
| 1706 | 12.951 |
| 1707 | 13.951 |
| 1708 | 11.161 |
| 1709 | 7.441 |
| 1710 | 6.761 |
| 1711 | 1.271 |
| 1712 | 2.271 |
| 1713 | 1.861 |
| 1714 | 2.861 |
| 1715 | 3.861 |
| 1716 | 0.331 |
| 1717 | 1.331 |
| 1718 | 2.331 |
| 1719 | 3.331 |
| 1720 | 4.331 |
| 1721 | 0.701 |
| 1722 | 0 |
| 1723 | 0 |
| 1724 | 1 |
| 1725 | 0.56 |
| 1726 | 0 |
| 1727 | 1 |
| 1728 | 2 |
| 1729 | 3 |
| 1730 | 4 |
| 1731 | 5 |
| 1732 | 6 |
| 1733 | 7 |
| 1734 | 8 |
| 1735 | 9 |
| 1736 | 10 |
| 1737 | 7.06 |
| 1738 | 8.06 |
| 1739 | 5.37 |
| 1740 | 6.37 |
| 1741 | 7.37 |
| 1742 | 8.37 |
| 1743 | 9.37 |
| 1744 | 10.37 |
| 1745 | 11.37 |
| 1746 | 12.37 |
| 1747 | 13.37 |
| 1748 | 13.05 |
| 1749 | 14.05 |
| 1750 | 15.05 |
| 1751 | 13.04 |
| 1752 | 14.04 |
| 1753 | 15.04 |
| 1754 | 16.04 |
| 1755 | 15.57 |
| 1756 | 16.57 |
| 1757 | 12.94 |
| 1758 | 13.94 |
| 1759 | 14.94 |
| 1760 | 15.94 |
| 1761 | 16.94 |
| 1762 | 17.94 |
| 1763 | 18.94 |
| 1764 | 15.8 |
| 1765 | 12.76 |
| 1766 | 9.43 |
| 1767 | 10.43 |
| 1768 | 11.43 |
| 1769 | 12.43 |
| 1770 | 13.43 |
| 1771 | 14.43 |
| 1772 | 15.43 |
| 1773 | 16.43 |
| 1774 | 17.43 |
| 1775 | 14.49 |
| 1776 | 15.49 |
| 1777 | 11.47 |
| 1778 | 12.47 |
| 1779 | 13.47 |
| 1780 | 14.47 |
| 1781 | 15.47 |
| 1782 | 16.47 |
| 1783 | 13.04 |
| 1784 | 9.12 |
| 1785 | 10.12 |
| 1786 | 11.12 |
| 1787 | 12.12 |
| 1788 | 9.72 |
| 1789 | 6.93 |
| 1790 | 3.01 |
| 1791 | 4.01 |
| 1792 | 5.01 |
| 1793 | 6.01 |
| 1794 | 3.51 |
| 1795 | 1.31 |
| 1796 | 2.31 |
| 1797 | 3.31 |
| 1798 | 0.52 |
| 1799 | 1.52 |
| 1800 | 2.52 |
| 1801 | 3.52 |
| 1802 | 0 |
| 1803 | 1 |
| 1804 | 0.62 |
| 1805 | 0 |
| 1806 | 1 |
| 1807 | 2 |
| 1808 | 3 |
| 1809 | 4 |
| 1810 | 1.45 |
| 1811 | 0 |
| 1812 | 1 |
| 1813 | 2 |
| 1814 | 3 |
| 1815 | 0 |
| 1816 | 1 |
| 1817 | 2 |
| 1818 | 3 |
| 1819 | 4 |
| 1820 | 5 |
| 1821 | 2.7 |
| 1822 | 3.7 |
| 1823 | 4.7 |
| 1824 | 5.7 |
| 1825 | 6.7 |
| 1826 | 2.98 |
| 1827 | 1.1 |
| 1828 | 0.65 |
| 1829 | 1.65 |
| 1830 | 0 |
| 1831 | 0 |
| 1832 | 1 |
| 1833 | 2 |
| 1834 | 3 |
| 1835 | 4 |
| 1836 | 2.26 |
| 1837 | 0.2 |
| 1838 | 0 |
| 1839 | 1 |
| 1840 | 2 |
| 1841 | 3 |
| 1842 | 0.84 |
| 1843 | 1.84 |
| 1844 | 0 |
| 1845 | 1 |
| 1846 | 2 |
| 1847 | 0 |
| 1848 | 0 |
| 1849 | 0 |
| 1850 | 0 |
| 1851 | 1 |
| 1852 | 2 |
| 1853 | 3 |
| 1854 | 4 |
| 1855 | 5 |
| 1856 | 6 |
| 1857 | 7 |
| 1858 | 4.4 |
| 1859 | 5.4 |
| 1860 | 2.85 |
| 1861 | 3.85 |
| 1862 | 4.85 |
| 1863 | 3.38 |
| 1864 | 4.38 |
| 1865 | 5.38 |
| 1866 | 6.38 |
| 1867 | 7.38 |
| 1868 | 4.44 |
| 1869 | 5.44 |
| 1870 | 3.14 |
| 1871 | 0 |
| 1872 | 1 |
| 1873 | 2 |
| 1874 | 3 |
| 1875 | 4 |
| 1876 | 3.53 |
| 1877 | 4.53 |
| 1878 | 2.52 |
| 1879 | 0.62 |
| 1880 | 1.62 |
| 1881 | 2.62 |
| 1882 | 3.62 |
| 1883 | 0 |
| 1884 | 0 |
| 1885 | 1 |
| 1886 | 2 |
| 1887 | 0 |
| 1888 | 1 |
| 1889 | 2 |
| 1890 | 3 |
| 1891 | 4 |
| 1892 | 5 |
| 1893 | 6 |
| 1894 | 7 |
| 1895 | 8 |
| 1896 | 5.89 |
| 1897 | 6.89 |
| 1898 | 7.89 |
| 1899 | 5.59 |
| 1900 | 6.59 |
| 1901 | 7.59 |
| 1902 | 8.59 |
| 1903 | 9.59 |
| 1904 | 10.59 |
| 1905 | 11.59 |
| 1906 | 12.59 |
| 1907 | 13.59 |
| 1908 | 14.59 |
| 1909 | 15.59 |
| 1910 | 13.53 |
| 1911 | 10.74 |
| 1912 | 11.74 |
| 1913 | 12.74 |
| 1914 | 13.74 |
| 1915 | 14.74 |
| 1916 | 15.74 |
| 1917 | 15.52 |
| 1918 | 16.52 |
| 1919 | 17.52 |
| 1920 | 13.6 |
| 1921 | 14.6 |
| 1922 | 15.6 |
| 1923 | 11.97 |
| 1924 | 12.97 |
| 1925 | 13.97 |
| 1926 | 11.42 |
| 1927 | 12.42 |
| 1928 | 13.42 |
| 1929 | 14.42 |
| 1930 | 15.42 |
| 1931 | 16.42 |
| 1932 | 14.26 |
| 1933 | 15.26 |
| 1934 | 16.26 |
| 1935 | 17.26 |
| 1936 | 18.26 |
| 1937 | 15.32 |
| 1938 | 14.5 |
| 1939 | 15.5 |
| 1940 | 16.5 |
| 1941 | 17.5 |
| 1942 | 18.5 |
| 1943 | 19.5 |
| 1944 | 16.9 |
| 1945 | 13.18 |
| 1946 | 14.18 |
| 1947 | 13.55 |
| 1948 | 14.55 |
| 1949 | 15.55 |
| 1950 | 16.55 |
| 1951 | 12.73 |
| 1952 | 13.73 |
| 1953 | 14.73 |
| 1954 | 15.73 |
| 1955 | 13.08 |
| 1956 | 14.08 |
| 1957 | 15.08 |
| 1958 | 16.08 |
| 1959 | 17.08 |
| 1960 | 18.08 |
| 1961 | 19.08 |
| 1962 | 20.08 |
| 1963 | 21.08 |
| 1964 | 22.08 |
| 1965 | 23.08 |
| 1966 | 24.08 |
| 1967 | 22.28 |
| 1968 | 23.28 |
| 1969 | 24.28 |
| 1970 | 25.28 |
| 1971 | 26.28 |
| 1972 | 27.28 |
| 1973 | 28.28 |
| 1974 | 29.28 |
| 1975 | 30.28 |
| 1976 | 29.76 |
| 1977 | 26.62 |
| 1978 | 27.62 |
| 1979 | 28.62 |
| 1980 | 29.62 |
| 1981 | 30.62 |
| 1982 | 31.62 |
| 1983 | 29.37 |
| 1984 | 30.37 |
| 1985 | 31.37 |
| 1986 | 32.37 |
| 1987 | 30.26 |
| 1988 | 31.26 |
| 1989 | 30.91 |
| 1990 | 31.91 |
| 1991 | 32.91 |
| 1992 | 33.91 |
| 1993 | 34.91 |
| 1994 | 35.91 |
| 1995 | 36.91 |
| 1996 | 34.07 |
| 1997 | 35.07 |
| 1998 | 36.07 |
| 1999 | 37.07 |
| 2000 | 38.07 |
| 2001 | 39.07 |
| 2002 | 40.07 |
| 2003 | 41.07 |
| 2004 | 42.07 |
| 2005 | 43.07 |
| 2006 | 39.84 |
| 2007 | 40.84 |
| 2008 | 41.84 |
| 2009 | 42.84 |
| 2010 | 43.84 |
| 2011 | 44.84 |
| 2012 | 45.84 |
| 2013 | 42.9 |
| 2014 | 43.9 |
| 2015 | 44.9 |
| 2016 | 45.9 |
| 2017 | 42.76 |
| 2018 | 43.76 |
| 2019 | 44.76 |
| 2020 | 45.76 |
| 2021 | 46.76 |
| 2022 | 43.13 |
| 2023 | 44.13 |
| 2024 | 45.13 |
| 2025 | 46.13 |
| 2026 | 47.13 |
| 2027 | 48.13 |
| 2028 | 49.13 |
| 2029 | 50.13 |
| 2030 | 51.13 |
| 2031 | 52.13 |
| 2032 | 53.13 |
| 2033 | 50.24 |
| 2034 | 51.24 |
| 2035 | 52.24 |
| 2036 | 53.24 |
| 2037 | 54.24 |
| 2038 | 53.82 |
| 2039 | 54.82 |
| 2040 | 55.82 |
| 2041 | 53.86 |
| 2042 | 51.94 |
| 2043 | 52.94 |
| 2044 | 53.94 |
| 2045 | 54.94 |
| 2046 | 55.94 |
| 2047 | 56.94 |
| 2048 | 57.94 |
| 2049 | 58.94 |
| 2050 | 59.94 |
| 2051 | 60.94 |
| 2052 | 58.29 |
| 2053 | 54.37 |
| 2054 | 55.37 |
| 2055 | 53.57 |
| 2056 | 54.57 |
| 2057 | 55.57 |
| 2058 | 53.02 |
| 2059 | 52.75 |
| 2060 | 53.75 |
| 2061 | 54.75 |
| 2062 | 55.75 |
| 2063 | 56.75 |
| 2064 | 57.75 |
| 2065 | 58.75 |
| 2066 | 56.45 |
| 2067 | 57.45 |
| 2068 | 55 |
| 2069 | 53.29 |
| 2070 | 50.6 |
| 2071 | 49.62 |
| 2072 | 50.62 |
| 2073 | 51.62 |
| 2074 | 52.62 |
| 2075 | 49.88 |
| 2076 | 50.88 |
| 2077 | 49.63 |
| 2078 | 50.63 |
| 2079 | 45.73 |
| 2080 | 46.73 |
| 2081 | 45.69 |
| 2082 | 46.69 |
| 2083 | 46.05 |
| 2084 | 47.05 |
| 2085 | 48.05 |
| 2086 | 49.05 |
| 2087 | 46.99 |
| 2088 | 47.99 |
| 2089 | 45.88 |
| 2090 | 43.63 |
| 2091 | 42.38 |
| 2092 | 40.03 |
| 2093 | 39.06 |
| 2094 | 40.06 |
| 2095 | 36.04 |
| 2096 | 37.04 |
| 2097 | 32.63 |
| 2098 | 33.63 |
| 2099 | 34.63 |
| 2100 | 35.63 |
| 2101 | 33.03 |
| 2102 | 31.25 |
| 2103 | 32.25 |
| 2104 | 33.25 |
| 2105 | 30.8 |
| 2106 | 31.8 |
| 2107 | 28.66 |
| 2108 | 29.66 |
| 2109 | 30.66 |
| 2110 | 30.13 |
| 2111 | 31.13 |
| 2112 | 28.19 |
| 2113 | 29.19 |
| 2114 | 30.19 |
| 2115 | 31.19 |
| 2116 | 32.19 |
| 2117 | 33.19 |
| 2118 | 34.19 |
| 2119 | 35.19 |
| 2120 | 36.19 |
| 2121 | 37.19 |
| 2122 | 35.56 |
| 2123 | 34.03 |
| 2124 | 35.03 |
| 2125 | 32.78 |
| 2126 | 32.1 |
| 2127 | 33.1 |
| 2128 | 34.1 |
| 2129 | 29.2 |
| 2130 | 28.14 |
| 2131 | 29.14 |
| 2132 | 28.56 |
| 2133 | 29.56 |
| 2134 | 30.56 |
| 2135 | 27.03 |
| 2136 | 28.03 |
| 2137 | 27.25 |
| 2138 | 24.9 |
| 2139 | 21.67 |
| 2140 | 22.67 |
| 2141 | 23.67 |
| 2142 | 24.67 |
| 2143 | 25.67 |
| 2144 | 26.67 |
| 2145 | 27.67 |
| 2146 | 28.67 |
| 2147 | 29.67 |
| 2148 | 30.67 |
| 2149 | 27.53 |
| 2150 | 28.53 |
| 2151 | 27.22 |
| 2152 | 25.26 |
| 2153 | 26.26 |
| 2154 | 27.26 |
| 2155 | 28.26 |
| 2156 | 25.81 |
| 2157 | 26.81 |
| 2158 | 25.46 |
| 2159 | 23.68 |
| 2160 | 24.68 |
| 2161 | 25.68 |
| 2162 | 26.68 |
| 2163 | 21 |
| 2164 | 22 |
| 2165 | 9.75 |
| 2166 | 10.75 |
| 2167 | 11.75 |
| 2168 | 12.75 |
| 2169 | 8.05 |
| 2170 | 9.05 |
| 2171 | 10.05 |
| 2172 | 11.05 |
| 2173 | 8.6 |
| 2174 | 4.39 |
| 2175 | 5.39 |
| 2176 | 6.39 |
| 2177 | 7.39 |
| 2178 | 8.39 |
| 2179 | 9.39 |
| 2180 | 7.04 |
| 2181 | 8.04 |
| 2182 | 9.04 |
| 2183 | 10.04 |
| 2184 | 11.04 |
| 2185 | 12.04 |
| 2186 | 13.04 |
| 2187 | 14.04 |
| 2188 | 12.45 |
| 2189 | 13.45 |
| 2190 | 14.45 |
| 2191 | 15.45 |
| 2192 | 16.45 |
| 2193 | 17.45 |
| 2194 | 18.45 |
| 2195 | 19.45 |
| 2196 | 20.45 |
| 2197 | 21.45 |
| 2198 | 22.45 |
| 2199 | 23.45 |
| 2200 | 24.45 |
| 2201 | 21.71 |
| 2202 | 19.6 |
| 2203 | 18.44 |
| 2204 | 19.44 |
| 2205 | 14.93 |
| 2206 | 15.93 |
| 2207 | 11.62 |
| 2208 | 12.62 |
| 2209 | 13.62 |
| 2210 | 14.62 |
| 2211 | 15.62 |
| 2212 | 16.62 |
| 2213 | 13.73 |
| 2214 | 14.73 |
| 2215 | 15.73 |
| 2216 | 12.69 |
| 2217 | 13.69 |
| 2218 | 14.69 |
| 2219 | 15.69 |
| 2220 | 16.69 |
| 2221 | 14.24 |
| 2222 | 12.59 |
| 2223 | 13.59 |
| 2224 | 14.59 |
| 2225 | 15.59 |
| 2226 | 16.59 |
| 2227 | 15.53 |
| 2228 | 16.53 |
| 2229 | 17.53 |
| 2230 | 13.41 |
| 2231 | 14.41 |
| 2232 | 15.41 |
| 2233 | 16.41 |
| 2234 | 17.41 |
| 2235 | 18.41 |
| 2236 | 19.41 |
| 2237 | 20.41 |
| 2238 | 21.41 |
| 2239 | 20.02 |
| 2240 | 21.02 |
| 2241 | 22.02 |
| 2242 | 23.02 |
| 2243 | 24.02 |
| 2244 | 25.02 |
| 2245 | 26.02 |
| 2246 | 27.02 |
| 2247 | 28.02 |
| 2248 | 29.02 |
| 2249 | 30.02 |
| 2250 | 31.02 |
| 2251 | 32.02 |
| 2252 | 33.02 |
| 2253 | 30.86 |
| 2254 | 31.86 |
| 2255 | 32.86 |
| 2256 | 33.86 |
| 2257 | 33.21 |
| 2258 | 32.09 |
| 2259 | 31.32 |
| 2260 | 29.77 |
| 2261 | 30.77 |
| 2262 | 31.77 |
| 2263 | 29.85 |
| 2264 | 29.2 |
| 2265 | 28.12 |
| 2266 | 26.59 |
| 2267 | 25.18 |
| 2268 | 26.18 |
| 2269 | 27.18 |
| 2270 | 26.45 |
| 2271 | 24.49 |
| 2272 | 25.49 |
| 2273 | 23.04 |
| 2274 | 21.98 |
| 2275 | 21.87 |
| 2276 | 20.01 |
| 2277 | 18 |
| 2278 | 19 |
| 2279 | 18.63 |
| 2280 | 16.38 |
| 2281 | 14.32 |
| 2282 | 14.18 |
| 2283 | 13.18 |
| 2284 | 14.18 |
| 2285 | 12.93 |
| 2286 | 13.93 |
| 2287 | 13.76 |
| 2288 | 13.57 |
| 2289 | 14.57 |
| 2290 | 12.22 |
| 2291 | 13.22 |
| 2292 | 14.22 |
| 2293 | 13.34 |
| 2294 | 14.34 |
| 2295 | 15.34 |
| 2296 | 16.34 |
| 2297 | 17.34 |
| 2298 | 15.38 |
| 2299 | 16.38 |
| 2300 | 17.38 |
| 2301 | 18.38 |
| 2302 | 19.38 |
| 2303 | 20.38 |
| 2304 | 18.99 |
| 2305 | 19.99 |
| 2306 | 20.99 |
| 2307 | 21.99 |
| 2308 | 22.99 |
| 2309 | 21.74 |
| 2310 | 22.74 |
| 2311 | 19.8 |
| 2312 | 18.37 |
| 2313 | 16.82 |
| 2314 | 15.29 |
| 2315 | 16.29 |
| 2316 | 15.9 |
| 2317 | 14.8 |
| 2318 | 13.88 |
| 2319 | 14.88 |
| 2320 | 15.88 |
| 2321 | 16.88 |
| 2322 | 17.88 |
| 2323 | 18.88 |
| 2324 | 19.88 |
| 2325 | 20.88 |
| 2326 | 21.88 |
| 2327 | 22.88 |
| 2328 | 23.88 |
| 2329 | 21.19 |
| 2330 | 22.19 |
| 2331 | 21.8 |
| 2332 | 21.28 |
| 2333 | 22.28 |
| 2334 | 23.28 |
| 2335 | 24.28 |
| 2336 | 22.61 |
| 2337 | 23.61 |
| 2338 | 23.39 |
| 2339 | 24.39 |
| 2340 | 25.39 |
| 2341 | 24.16 |
| 2342 | 25.16 |
| 2343 | 26.16 |
| 2344 | 27.16 |
| 2345 | 28.16 |
| 2346 | 29.16 |
| 2347 | 28.33 |
| 2348 | 29.33 |
| 2349 | 30.33 |
| 2350 | 29.78 |
| 2351 | 29 |
| 2352 | 30 |
| 2353 | 31 |
| 2354 | 32 |
| 2355 | 33 |
| 2356 | 32.6 |
| 2357 | 33.6 |
| 2358 | 34.6 |
| 2359 | 32.64 |
| 2360 | 33.64 |
| 2361 | 32.58 |
| 2362 | 33.58 |
| 2363 | 34.58 |
| 2364 | 35.58 |
| 2365 | 33.89 |
| 2366 | 32.58 |
| 2367 | 33.58 |
| 2368 | 31.33 |
| 2369 | 28.88 |
| 2370 | 28.53 |
| 2371 | 26.81 |
| 2372 | 26.54 |
| 2373 | 27.54 |
| 2374 | 26.07 |
| 2375 | 27.07 |
| 2376 | 24.96 |
| 2377 | 25.96 |
| 2378 | 26.96 |
| 2379 | 27.96 |
| 2380 | 28.96 |
| 2381 | 28.49 |
| 2382 | 29.49 |
| 2383 | 30.49 |
| 2384 | 30.28 |
| 2385 | 29.67 |
| 2386 | 28.98 |
| 2387 | 27.12 |
| 2388 | 26.5 |
| 2389 | 25.01 |
| 2390 | 22.66 |
| 2391 | 23.66 |
| 2392 | 24.66 |
| 2393 | 25.66 |
| 2394 | 26.66 |
| 2395 | 25.98 |
| 2396 | 24.98 |
| 2397 | 25.98 |
| 2398 | 26.98 |
| 2399 | 24.73 |
| 2400 | 25.73 |
| 2401 | 24.93 |
| 2402 | 25.93 |
| 2403 | 26.93 |
| 2404 | 25.97 |
| 2405 | 26.97 |
| 2406 | 27.97 |
| 2407 | 28.97 |
| 2408 | 26.91 |
| 2409 | 27.91 |
| 2410 | 28.91 |
| 2411 | 27.42 |
| 2412 | 28.42 |
| 2413 | 29.42 |
| 2414 | 28.72 |
| 2415 | 27.31 |
| 2416 | 28.31 |
| 2417 | 29.31 |
| 2418 | 28.57 |
| 2419 | 29.57 |
| 2420 | 27.61 |
| 2421 | 28.61 |
| 2422 | 27.57 |
| 2423 | 28.57 |
| 2424 | 27.34 |
| 2425 | 28.34 |
| 2426 | 27.05 |
| 2427 | 28.05 |
| 2428 | 29.05 |
| 2429 | 28.05 |
| 2430 | 29.05 |
| 2431 | 30.05 |
| 2432 | 29.33 |
| 2433 | 30.33 |
| 2434 | 31.33 |
| 2435 | 32.33 |
| 2436 | 33.33 |
| 2437 | 34.33 |
| 2438 | 35.33 |
| 2439 | 36.33 |
| 2440 | 37.33 |
| 2441 | 38.33 |
| 2442 | 36.68 |
| 2443 | 37.68 |
| 2444 | 38.68 |
| 2445 | 39.68 |
| 2446 | 37.28 |
| 2447 | 35.65 |
| 2448 | 34.92 |
| 2449 | 35.92 |
| 2450 | 34.53 |
| 2451 | 35.53 |
| 2452 | 36.53 |
| 2453 | 35.68 |
| 2454 | 35.39 |
| 2455 | 36.39 |
| 2456 | 35.88 |
| 2457 | 34.35 |
| 2458 | 35.35 |
| 2459 | 36.35 |
| 2460 | 36 |
| 2461 | 35.15 |
| 2462 | 33.76 |
| 2463 | 34.76 |
| 2464 | 35.76 |
| 2465 | 35.1 |
| 2466 | 33.67 |
| 2467 | 32.67 |
| 2468 | 33.67 |
| 2469 | 34.67 |
| 2470 | 35.67 |
| 2471 | 33.98 |